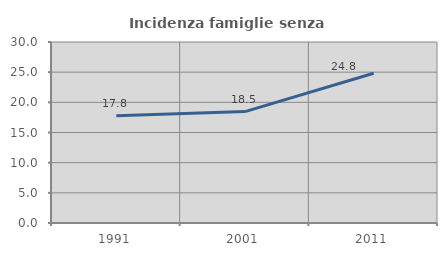
| Category | Incidenza famiglie senza nuclei |
|---|---|
| 1991.0 | 17.778 |
| 2001.0 | 18.47 |
| 2011.0 | 24.818 |